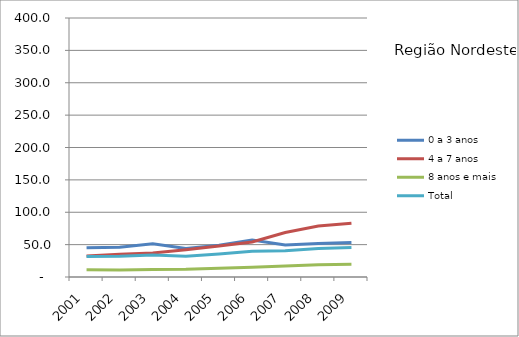
| Category | 0 a 3 anos | 4 a 7 anos | 8 anos e mais | Total |
|---|---|---|---|---|
| 2001.0 | 45 | 32.3 | 11.3 | 31.5 |
| 2002.0 | 46.1 | 35.1 | 10.8 | 31.9 |
| 2003.0 | 51.5 | 36.9 | 11.7 | 34.1 |
| 2004.0 | 44.2 | 42.2 | 11.8 | 32.1 |
| 2005.0 | 49.2 | 47.7 | 13.4 | 35.5 |
| 2006.0 | 57.3 | 54.1 | 14.9 | 39.9 |
| 2007.0 | 49.4 | 68.6 | 16.9 | 40.7 |
| 2008.0 | 51.8 | 78.6 | 18.9 | 44 |
| 2009.0 | 53.3 | 83.1 | 19.5 | 45.5 |